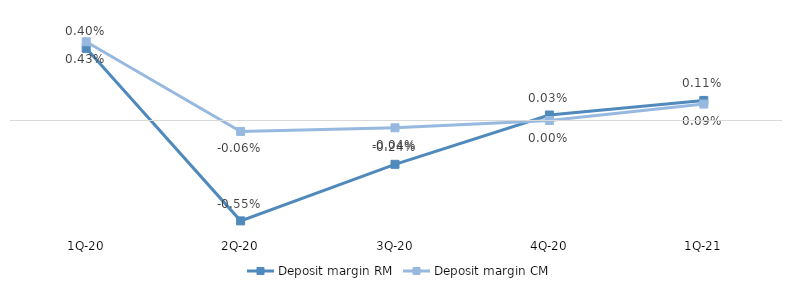
| Category | Deposit margin RM | Deposit margin CM |
|---|---|---|
| 1Q-21 | 0.001 | 0.001 |
| 4Q-20 | 0 | 0 |
| 3Q-20 | -0.002 | 0 |
| 2Q-20 | -0.006 | -0.001 |
| 1Q-20 | 0.004 | 0.004 |